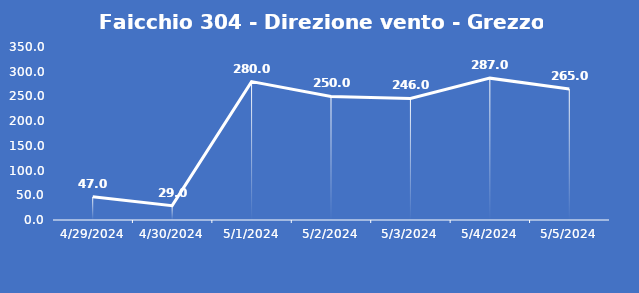
| Category | Faicchio 304 - Direzione vento - Grezzo (°N) |
|---|---|
| 4/29/24 | 47 |
| 4/30/24 | 29 |
| 5/1/24 | 280 |
| 5/2/24 | 250 |
| 5/3/24 | 246 |
| 5/4/24 | 287 |
| 5/5/24 | 265 |